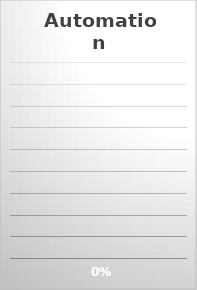
| Category | Series 0 |
|---|---|
| All Controls Automated: | 0 |